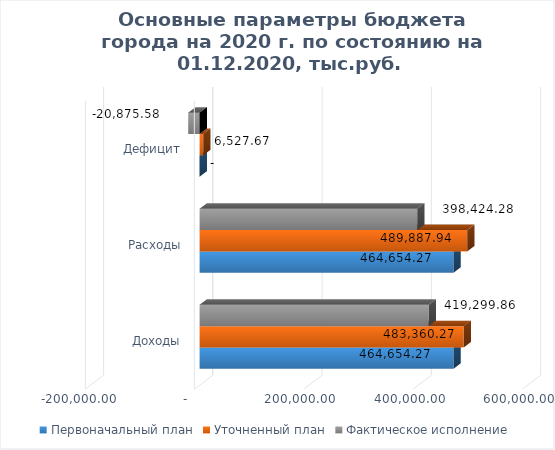
| Category | Первоначальный план | Уточненный план | Фактическое исполнение |
|---|---|---|---|
| Доходы | 464654.271 | 483360.273 | 419299.859 |
| Расходы | 464654.271 | 489887.943 | 398424.28 |
| Дефицит | 0 | 6527.67 | -20875.578 |